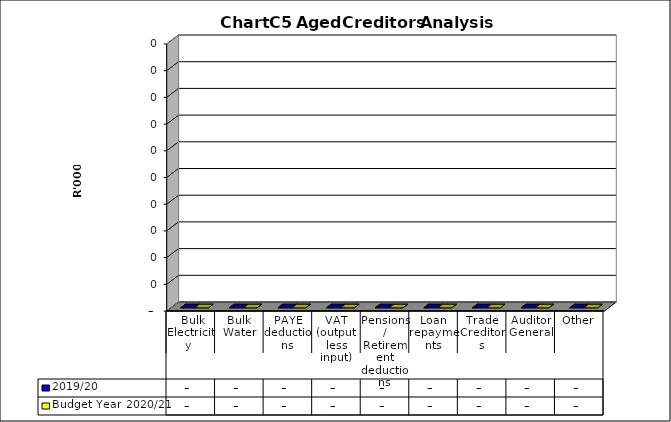
| Category | 2019/20 | Budget Year 2020/21 |
|---|---|---|
|  Bulk Electricity  | 0 | 0 |
| Bulk Water | 0 | 0 |
| PAYE deductions | 0 | 0 |
| VAT (output less input) | 0 | 0 |
| Pensions / Retirement deductions | 0 | 0 |
| Loan repayments | 0 | 0 |
| Trade Creditors | 0 | 0 |
| Auditor General | 0 | 0 |
| Other | 0 | 0 |